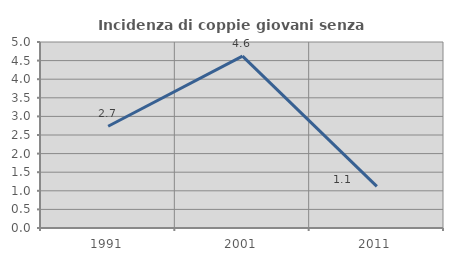
| Category | Incidenza di coppie giovani senza figli |
|---|---|
| 1991.0 | 2.734 |
| 2001.0 | 4.62 |
| 2011.0 | 1.12 |